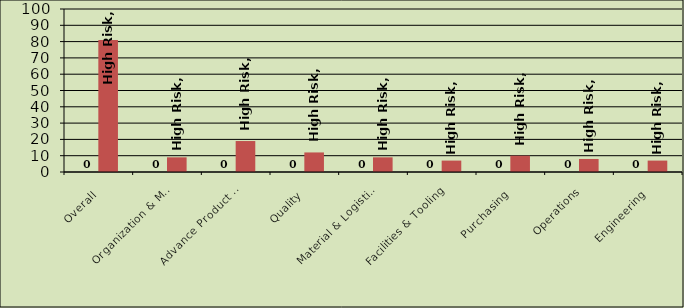
| Category | Series 0 | High Risk |
|---|---|---|
| Overall | 0 | 81 |
| Organization & Management | 0 | 9 |
| Advance Product Planning | 0 | 19 |
| Quality | 0 | 12 |
| Material & Logistics | 0 | 9 |
| Facilities & Tooling | 0 | 7 |
| Purchasing | 0 | 10 |
| Operations | 0 | 8 |
| Engineering | 0 | 7 |